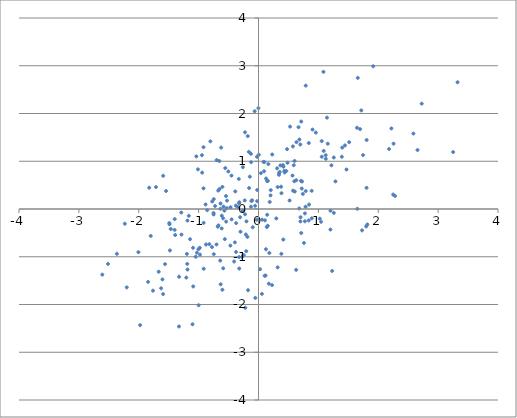
| Category | Series 0 |
|---|---|
| 0.34169083185123966 | 0.716 |
| -0.12529494675494762 | 0.048 |
| -0.9150863760306407 | -1.252 |
| -0.22485663523840604 | -0.111 |
| 0.22613245804369514 | -1.594 |
| -0.4490756869465068 | -0.217 |
| -0.3443059665474907 | 0.041 |
| 0.8883483582809655 | 0.38 |
| -0.6238685149002047 | 1.286 |
| 0.47694368214240984 | 1.253 |
| -0.052771363421932255 | -1.862 |
| -0.0012278035988090928 | 2.113 |
| 2.248377299510798 | 0.302 |
| -2.232500583199658 | -0.308 |
| -1.3263435225277318 | -1.419 |
| -0.38812113264855097 | 0.368 |
| 1.0237197803514513 | -0.202 |
| 0.31979981495407733 | -1.222 |
| 0.1085058554985546 | -0.238 |
| 2.1808317080417496 | 1.256 |
| -1.5928212413966967 | -1.782 |
| -1.1863231726155967 | -0.242 |
| -0.02719278465464931 | -0.224 |
| 1.650546320493534 | 0.004 |
| 1.1214802786515488 | 1.128 |
| -0.504091378589482 | 0.785 |
| 2.656010779995004 | 1.235 |
| 0.5197830245397113 | 0.178 |
| -1.0028982808048224 | -0.842 |
| 1.5143108786828794 | 1.399 |
| -0.9448296695001644 | 1.127 |
| 0.5767981848592169 | 0.384 |
| -1.4655644928681664 | -0.419 |
| -0.8837133120053711 | 0.095 |
| -0.591092873032775 | -0.194 |
| 2.7260500290512955 | 2.206 |
| -0.7471320959343427 | 0.207 |
| 0.7882337471791863 | 0.375 |
| -0.39431518306479507 | -0.7 |
| -0.7495834125060258 | -0.114 |
| 0.38200958961161713 | -0.939 |
| -0.09602341193810385 | -0.383 |
| -0.1619289673775529 | 1.196 |
| 3.3244140668726265 | 2.654 |
| -0.5407266350319244 | -0.263 |
| -0.6032899563336376 | -1.691 |
| 1.3917070776496032 | 1.094 |
| -2.0056792475487493 | -0.904 |
| -0.7730567101700225 | 0.158 |
| -1.489334312790324 | -0.295 |
| -0.02226966909187892 | 0.164 |
| -0.668898105109462 | -0.343 |
| -0.3785784075565728 | 0.071 |
| 0.3112345969410358 | 0.851 |
| -2.2001607420983262 | -1.642 |
| 0.12452573964043442 | -0.843 |
| -0.2248949496814708 | 1.606 |
| 1.798324578503009 | -0.366 |
| -0.7470281259377719 | -0.946 |
| -0.7508262503133274 | -0.084 |
| -0.6025750236196137 | 0.463 |
| 2.2561077291907456 | 1.368 |
| 1.285249792148205 | 0.579 |
| 1.4446641611460118 | 1.331 |
| -0.7764059497332659 | -0.798 |
| 0.6287925479078317 | -1.275 |
| 0.7027042077232639 | -0.172 |
| -0.17451891248172438 | -1.7 |
| 0.005367241055468967 | 1.137 |
| -1.2868693533059072 | -0.536 |
| 2.5869579736092745 | 1.58 |
| -1.5606140219557534 | -1.155 |
| -0.589643313168277 | -1.242 |
| -0.4511617167747278 | 0.699 |
| 3.2509006441893846 | 1.193 |
| -0.8208898703692125 | -0.737 |
| -0.3237412510200548 | -1.007 |
| 0.41372402634569017 | -0.639 |
| -2.609038719223526 | -1.374 |
| 0.4635930550312629 | 0.795 |
| 0.43755808707353494 | 0.765 |
| 1.0454756931904272 | -0.268 |
| -0.6350385907312436 | 0.004 |
| 1.1439798817819236 | 1.914 |
| 0.1814897496089981 | -0.921 |
| -0.26105268297703743 | 0.875 |
| -0.5629320307630162 | -0.631 |
| -0.021650454831016797 | 0.398 |
| -1.3282556941252563 | -2.461 |
| -0.6544176388753267 | 1.005 |
| -1.0933515470566453 | -0.813 |
| -1.0282110064165981 | -0.914 |
| 0.6982803197142055 | 1.351 |
| 0.20447852348235504 | 0.395 |
| 0.6305960061401876 | 0.603 |
| 0.713019580361219 | 1.832 |
| 1.4694348337628107 | 0.828 |
| 0.7396748268139148 | 0.316 |
| 1.218079429678573 | 0.915 |
| 0.1185582781032851 | -1.393 |
| 0.4170142488007742 | 0.886 |
| 0.14507408275100975 | -0.121 |
| -0.373293043446805 | -0.296 |
| 1.645570954077648 | 1.701 |
| 1.0553628624566798 | 1.422 |
| -1.1903802617549495 | -1.149 |
| -1.0488978872709367 | -1 |
| 1.0884361921847894 | 1.216 |
| 0.7860160730315164 | 0.046 |
| 0.12650425914200025 | 0.638 |
| -1.090185321028531 | -1.622 |
| -0.7245389754029102 | 0.062 |
| -0.20073109327307778 | -0.259 |
| 0.7748697579325301 | -0.257 |
| 1.0849625473636382 | 2.872 |
| 0.6344450574796996 | 1.4 |
| -0.6500110467126807 | 0.42 |
| -0.9996119163103527 | -2.016 |
| -1.4862523980023352 | -0.319 |
| -0.672534834650544 | 0.386 |
| 0.6998021274039995 | -0.26 |
| 0.0572506238423678 | -1.778 |
| 1.2300764425205462 | -1.297 |
| -0.26172201591427796 | -0.039 |
| 0.060083399454025216 | -0.223 |
| -0.46705208429459205 | 0.037 |
| 0.10224783955706712 | -1.399 |
| 0.6837451171082859 | 1.455 |
| 1.7167358221883477 | 2.064 |
| 0.5751479368330994 | 1.31 |
| 1.696943545677965 | 1.673 |
| -1.1427256487411481 | -0.633 |
| -0.6136537502717199 | -0.14 |
| 0.22936462341264252 | 1.142 |
| -0.6394096814446839 | -1.08 |
| -0.1854605853586421 | -0.584 |
| -1.1635628176008501 | -0.143 |
| 1.915498653747239 | 2.99 |
| -1.185349013055875 | -1.268 |
| 0.14439819873254758 | 0.585 |
| -1.7622332789634996 | -1.71 |
| 0.6683058030384214 | 1.714 |
| 1.7296162359593068 | -0.447 |
| -0.9182286767891236 | 1.295 |
| 0.8400790284455101 | 1.382 |
| 1.8057687031057865 | 1.445 |
| -0.21118956012495244 | -0.534 |
| 0.1558977667170208 | 0.589 |
| -0.20398474879918305 | -0.883 |
| 0.3657643620944367 | 0.913 |
| -0.25351112908216905 | -0.037 |
| -0.554599067412433 | 0.857 |
| 0.2013345862061671 | 0.285 |
| 0.9579581201978863 | 1.6 |
| -0.17958478802246913 | 1.526 |
| -0.3291147373205817 | 0.629 |
| -0.27172995948166195 | -1 |
| -0.5428357999740512 | 0.271 |
| 0.43136669653880144 | 0.797 |
| -1.626613840318814 | -1.661 |
| 0.16534484964042703 | 0.941 |
| -1.1955273276633045 | -0.941 |
| -0.5846899137087777 | 0.051 |
| -1.2894736180016886 | -0.074 |
| -1.0111465190776483 | 0.83 |
| 1.2577550553418666 | 1.078 |
| 1.056351896963293 | 1.094 |
| 0.6021663035621118 | 1.006 |
| -0.3751404470485261 | -0.899 |
| 0.15403646993771863 | -0.351 |
| 0.6069520387371058 | 0.366 |
| 0.9021348022203571 | 1.664 |
| 0.3772695399542476 | 0.467 |
| -0.11861439163324021 | 0.168 |
| -1.0381982276144441 | 1.101 |
| 0.18724651971695427 | 0.148 |
| -0.31911137751956115 | 0.141 |
| 0.48413423335785943 | 0.968 |
| -0.06391125318130722 | 2.047 |
| -0.10568147498313439 | 0.182 |
| 0.5679213705256748 | 0.7 |
| -1.8448068373651683 | -1.526 |
| 0.7095232834274958 | 0.589 |
| -1.6044265401419984 | -1.474 |
| 0.09376569798435512 | 0.79 |
| 0.7271634003695442 | 0.576 |
| 0.13892044357790315 | -0.379 |
| -0.6807272326114918 | -0.37 |
| -0.02562041182482454 | 1.093 |
| 1.2012123271296176 | -0.431 |
| -2.512965522669008 | -1.15 |
| -0.2297027834192232 | 0.179 |
| -0.9184524940987797 | 0.433 |
| -0.40699131954916423 | -1.1 |
| -1.6668527369340402 | -1.314 |
| -0.056464708455449805 | 0.067 |
| 0.7888388466082096 | 2.583 |
| -0.12309770937564306 | 0.981 |
| -1.825923259277428 | 0.446 |
| -0.2460054062574453 | -0.966 |
| -0.5308194473612926 | 0.019 |
| 0.297165948246887 | -0.198 |
| -0.6338601611568286 | 0.115 |
| -1.5920821858525096 | 0.695 |
| -2.365067139449379 | -0.938 |
| -1.4790663653486589 | -0.868 |
| 0.32019944380637505 | 0.46 |
| -0.9771292570679082 | -0.955 |
| -0.46968609271649825 | -0.766 |
| 0.4069586618111094 | 0.92 |
| -0.12608520546696955 | 1.156 |
| 1.7464896722766188 | 1.128 |
| -0.32574541810064966 | 0.123 |
| 1.2021744091649107 | -0.035 |
| 0.7227863754404524 | 0.429 |
| 2.2194371411628793 | 1.687 |
| 1.2580821902992534 | -0.081 |
| 2.280436996257851 | 0.274 |
| 0.7140540139613019 | -0.503 |
| -0.6988322106267547 | 1.025 |
| -0.8041794627097351 | 1.417 |
| 0.3837526490445415 | 0.331 |
| -0.525103560876504 | 0.175 |
| -0.30017503060949874 | -0.477 |
| 1.1570011455988798 | 1.368 |
| -0.32212707856091904 | -1.246 |
| -0.7017476671116991 | -0.742 |
| -0.614329409775555 | -0.407 |
| -0.8769438999107982 | -0.744 |
| -0.9161147998292607 | -0.29 |
| -1.976898975288674 | -2.433 |
| 0.04041732641531126 | 0.75 |
| -1.101898122885839 | -2.414 |
| 0.7592063135586171 | -0.71 |
| 1.3985479375884549 | 1.286 |
| -0.22061968336290808 | -2.068 |
| -1.4010658180942186 | -0.438 |
| 0.8383631369840937 | -0.24 |
| 0.8900936739837823 | -0.195 |
| -0.144343181833401 | 0.677 |
| 0.354137238425874 | 0.774 |
| 0.5274872414029432 | 1.726 |
| 0.09851973107939996 | 0.983 |
| 1.6579540331020712 | 2.745 |
| -0.6314962770640614 | -1.576 |
| -0.3067037817846389 | -0.173 |
| -1.7999876549582858 | -0.564 |
| -0.9810295250931863 | -0.811 |
| 0.02503847678478898 | -1.261 |
| 0.17305323013393875 | -1.564 |
| 0.5984077975889277 | 0.581 |
| 0.7756378898330143 | -0.093 |
| 1.818192362586121 | -0.324 |
| 0.6795576979954159 | 0.011 |
| -1.3911141526644255 | -0.545 |
| 0.08382196864548881 | 0.986 |
| -0.9413450134915591 | 0.762 |
| 0.3441560583529424 | 0.753 |
| -1.399354700512268 | -0.211 |
| -1.5440862782445492 | 0.377 |
| 1.8045491948549262 | 0.444 |
| -1.7127688804297976 | 0.459 |
| -0.8565295773975702 | -0.024 |
| -1.2059990901665452 | -1.437 |
| 0.5887580244675377 | 0.917 |
| 1.124202260073535 | 1.051 |
| -0.15675045831918555 | 0.438 |
| 0.8438874736675502 | 0.093 |
| -0.5698761781417135 | -0.034 |